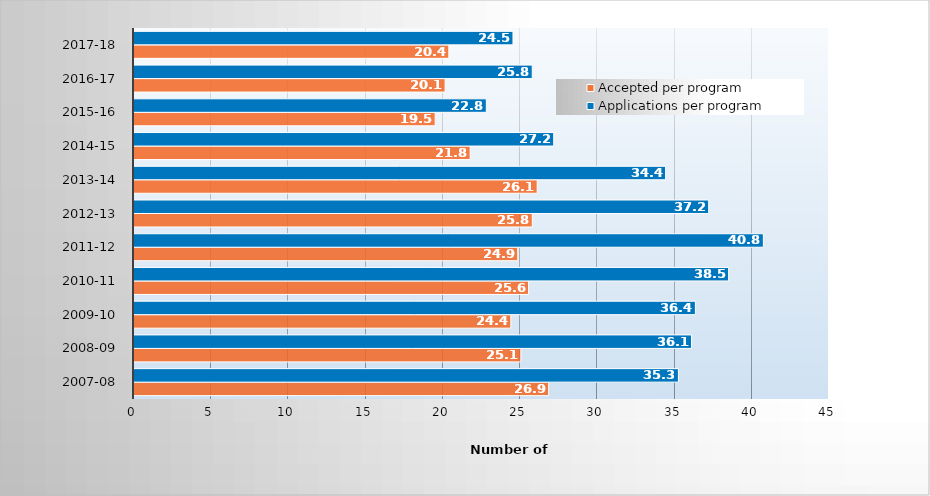
| Category | Accepted per program | Applications per program |
|---|---|---|
| 2007-08 | 26.85 | 35.25 |
| 2008-09 | 25.05 | 36.1 |
| 2009-10 | 24.4 | 36.35 |
| 2010-11 | 25.55 | 38.5 |
| 2011-12 | 24.85 | 40.75 |
| 2012-13 | 25.789 | 37.211 |
| 2013-14 | 26.105 | 34.421 |
| 2014-15 | 21.765 | 27.176 |
| 2015-16 | 19.5 | 22.812 |
| 2016-17 | 20.143 | 25.786 |
| 2017-18 | 20.385 | 24.538 |